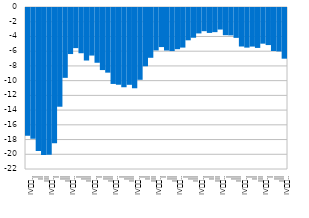
| Category | Биланс текућих трансакција (у % БДП-а) |
|---|---|
| IV
2007. | -17.335 |
| I | -17.769 |
| II | -19.419 |
| III | -19.947 |
| IV
2008. | -19.941 |
| I | -18.368 |
| II | -13.408 |
| III | -9.485 |
| IV
2009. | -6.254 |
| I | -5.448 |
| II | -6.144 |
| III | -7.133 |
| IV
2010. | -6.459 |
| I | -7.436 |
| II | -8.428 |
| III | -8.779 |
| IV
2011. | -10.313 |
| I | -10.421 |
| II | -10.762 |
| III | -10.432 |
| IV
2012. | -10.901 |
| I | -9.751 |
| II | -7.918 |
| III | -6.762 |
| IV
2013. | -5.761 |
| I | -5.308 |
| II | -5.776 |
| III | -5.85 |
| IV
2014. | -5.596 |
| I | -5.376 |
| II | -4.387 |
| III | -4.038 |
| IV
2015. | -3.454 |
| I | -3.149 |
| II | -3.384 |
| III | -3.279 |
| IV
2016. | -2.927 |
| I | -3.692 |
| II | -3.715 |
| III | -4.058 |
| IV
2017. | -5.23 |
| I | -5.381 |
| II | -5.239 |
| III | -5.42 |
| IV
2018. | -4.844 |
| I | -5.035 |
| II | -5.838 |
| III | -5.902 |
| IV
2019. | -6.882 |